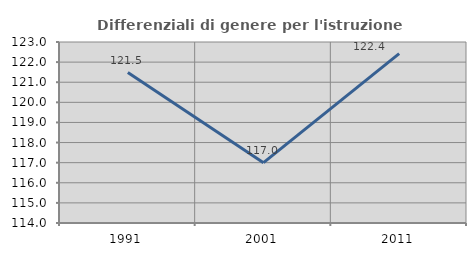
| Category | Differenziali di genere per l'istruzione superiore |
|---|---|
| 1991.0 | 121.479 |
| 2001.0 | 117 |
| 2011.0 | 122.426 |